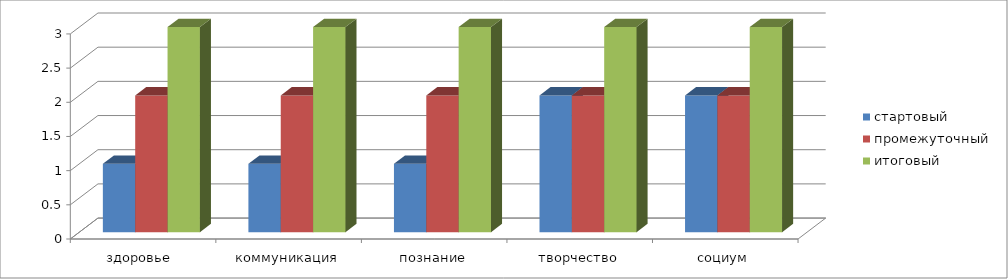
| Category | стартовый | промежуточный | итоговый |
|---|---|---|---|
| здоровье  | 1 | 2 | 3 |
| коммуникация | 1 | 2 | 3 |
| познание | 1 | 2 | 3 |
| творчество | 2 | 2 | 3 |
| социум | 2 | 2 | 3 |